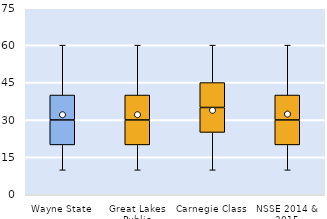
| Category | 25th | 50th | 75th |
|---|---|---|---|
| Wayne State | 20 | 10 | 10 |
| Great Lakes Public | 20 | 10 | 10 |
| Carnegie Class | 25 | 10 | 10 |
| NSSE 2014 & 2015 | 20 | 10 | 10 |